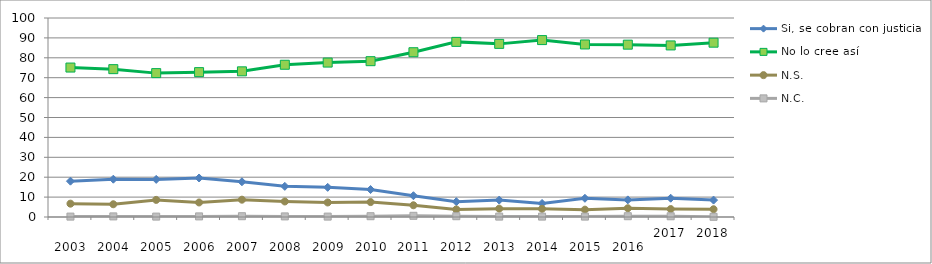
| Category | Si, se cobran con justicia | No lo cree así | N.S. | N.C. |
|---|---|---|---|---|
| 
2003
 | 18 | 75.1 | 6.7 | 0.2 |
| 
2004
 | 19 | 74.3 | 6.4 | 0.3 |
| 
2005
 | 18.9 | 72.3 | 8.6 | 0.2 |
| 
2006
 | 19.6 | 72.8 | 7.3 | 0.3 |
| 
2007
 | 17.7 | 73.2 | 8.7 | 0.4 |
| 
2008
 | 15.4 | 76.5 | 7.8 | 0.3 |
| 
2009
 | 14.9 | 77.6 | 7.3 | 0.2 |
| 
2010
 | 13.8 | 78.3 | 7.5 | 0.4 |
| 
2011
 | 10.7 | 82.8 | 5.9 | 0.6 |
| 
2012
 | 7.7 | 88 | 3.8 | 0.4 |
| 
2013
 | 8.5 | 87 | 4.2 | 0.2 |
| 
2014
 | 6.8 | 88.9 | 4.1 | 0.2 |
| 
2015
 | 9.4 | 86.7 | 3.7 | 0.2 |
| 
2016
 | 8.6 | 86.6 | 4.4 | 0.4 |
| 2017 | 9.431 | 86.22 | 3.984 | 0.366 |
| 2018 | 8.5 | 87.6 | 3.9 | 0.1 |